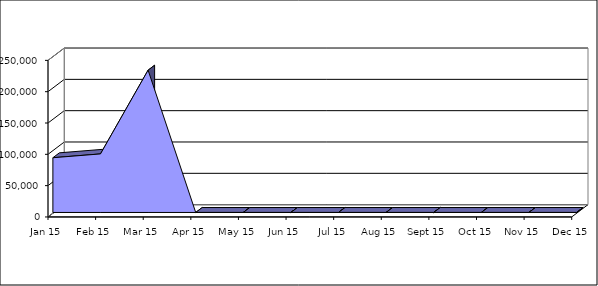
| Category | Jan 15 |
|---|---|
| 2015-01-01 | 87354 |
| 2015-02-01 | 93467 |
| 2015-03-01 | 227174 |
| 2015-04-01 | 0 |
| 2015-05-01 | 0 |
| 2015-06-01 | 0 |
| 2015-07-01 | 0 |
| 2015-08-01 | 0 |
| 2015-09-01 | 0 |
| 2015-10-01 | 0 |
| 2015-11-01 | 0 |
| 2015-12-01 | 0 |